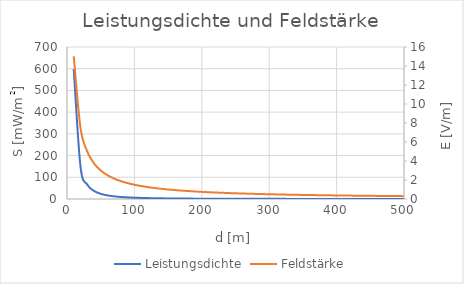
| Category | Leistungsdichte |
|---|---|
| 10.0 | 598.248 |
| 20.0 | 149.562 |
| 30.0 | 66.472 |
| 40.0 | 37.391 |
| 50.0 | 23.93 |
| 60.0 | 16.618 |
| 70.0 | 12.209 |
| 80.0 | 9.348 |
| 90.0 | 7.386 |
| 100.0 | 5.982 |
| 110.0 | 4.944 |
| 120.0 | 4.155 |
| 130.0 | 3.54 |
| 140.0 | 3.052 |
| 150.0 | 2.659 |
| 160.0 | 2.337 |
| 170.0 | 2.07 |
| 180.0 | 1.846 |
| 190.0 | 1.657 |
| 200.0 | 1.496 |
| 210.0 | 1.357 |
| 220.0 | 1.236 |
| 230.0 | 1.131 |
| 240.0 | 1.039 |
| 250.0 | 0.957 |
| 260.0 | 0.885 |
| 270.0 | 0.821 |
| 280.0 | 0.763 |
| 290.0 | 0.711 |
| 300.0 | 0.665 |
| 310.0 | 0.623 |
| 320.0 | 0.584 |
| 330.0 | 0.549 |
| 340.0 | 0.518 |
| 350.0 | 0.488 |
| 360.0 | 0.462 |
| 370.0 | 0.437 |
| 380.0 | 0.414 |
| 390.0 | 0.393 |
| 400.0 | 0.374 |
| 410.0 | 0.356 |
| 420.0 | 0.339 |
| 430.0 | 0.324 |
| 440.0 | 0.309 |
| 450.0 | 0.295 |
| 460.0 | 0.283 |
| 470.0 | 0.271 |
| 480.0 | 0.26 |
| 490.0 | 0.249 |
| 500.0 | 0.239 |